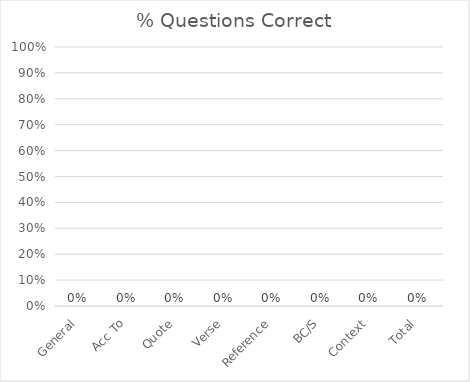
| Category | % Correct: |
|---|---|
| General | 0 |
| Acc To | 0 |
| Quote | 0 |
| Verse | 0 |
| Reference | 0 |
| BC/S | 0 |
| Context | 0 |
| Total | 0 |